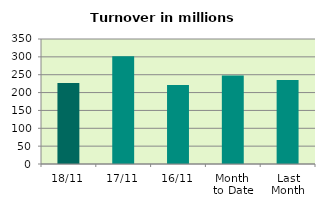
| Category | Series 0 |
|---|---|
| 18/11 | 226.656 |
| 17/11 | 301.776 |
| 16/11 | 221.299 |
| Month 
to Date | 248.1 |
| Last
Month | 235.36 |